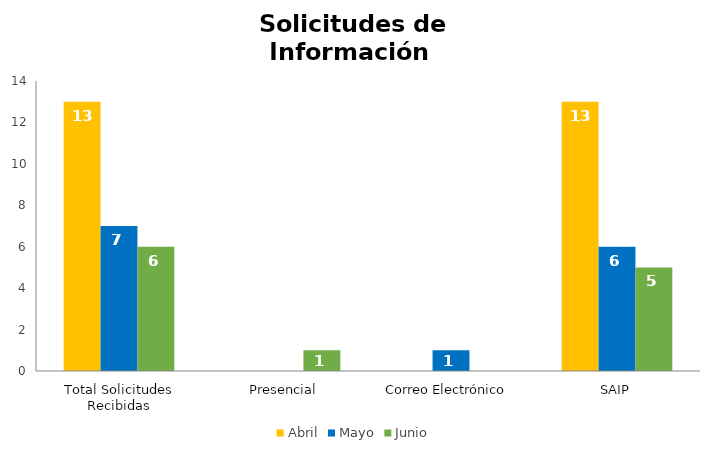
| Category | Abril | Mayo | Junio |
|---|---|---|---|
| Total Solicitudes Recibidas | 13 | 7 | 6 |
| Presencial | 0 | 0 | 1 |
| Correo Electrónico  | 0 | 1 | 0 |
| SAIP | 13 | 6 | 5 |